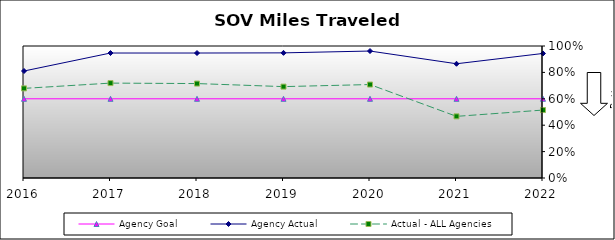
| Category | Agency Goal | Agency Actual | Actual - ALL Agencies |
|---|---|---|---|
| 2016.0 | 0.6 | 0.811 | 0.679 |
| 2017.0 | 0.6 | 0.947 | 0.719 |
| 2018.0 | 0.6 | 0.947 | 0.715 |
| 2019.0 | 0.6 | 0.948 | 0.692 |
| 2020.0 | 0.6 | 0.962 | 0.708 |
| 2021.0 | 0.6 | 0.866 | 0.467 |
| 2022.0 | 0.6 | 0.944 | 0.515 |